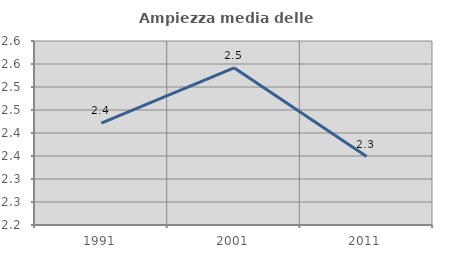
| Category | Ampiezza media delle famiglie |
|---|---|
| 1991.0 | 2.421 |
| 2001.0 | 2.542 |
| 2011.0 | 2.349 |